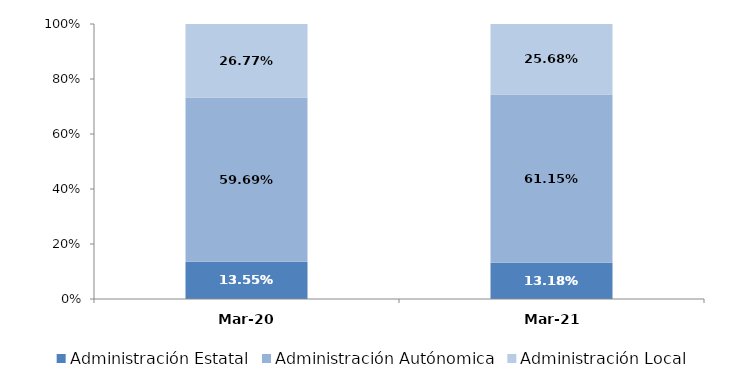
| Category | Administración Estatal | Administración Autónomica | Administración Local |
|---|---|---|---|
| 2020-03-01 | 0.135 | 0.597 | 0.268 |
| 2021-03-01 | 0.132 | 0.611 | 0.257 |